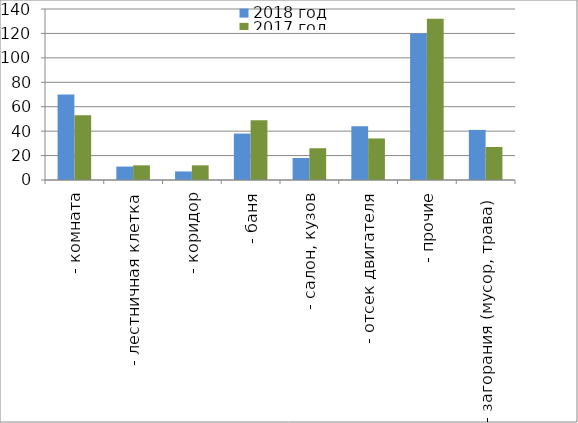
| Category | 2018 год | 2017 год |
|---|---|---|
|  - комната | 70 | 53 |
|  - лестничная клетка | 11 | 12 |
|  - коридор | 7 | 12 |
|  - баня | 38 | 49 |
|  - салон, кузов | 18 | 26 |
|  - отсек двигателя | 44 | 34 |
| - прочие | 120 | 132 |
| - загорания (мусор, трава)  | 41 | 27 |